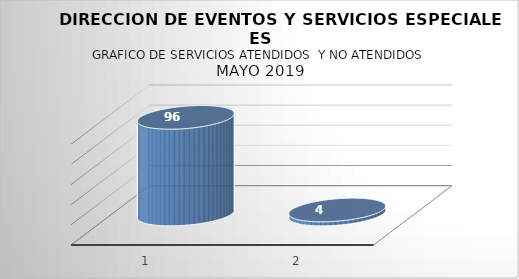
| Category | Series 0 |
|---|---|
| 0 | 96 |
| 1 | 4 |